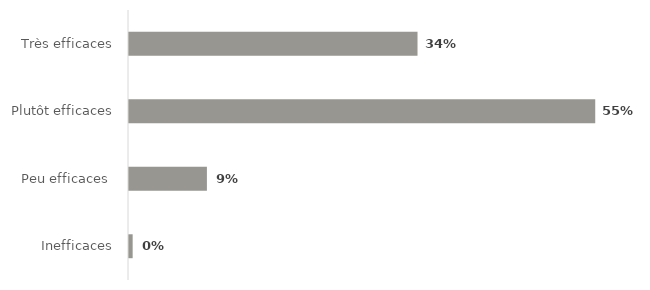
| Category | Series 0 |
|---|---|
| Inefficaces | 0.004 |
| Peu efficaces  | 0.091 |
| Plutôt efficaces | 0.546 |
| Très efficaces | 0.338 |